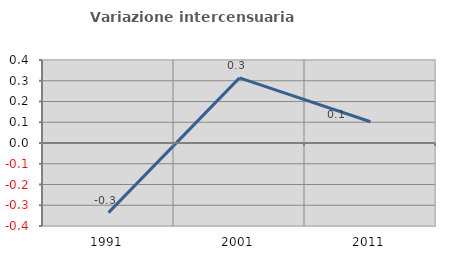
| Category | Variazione intercensuaria annua |
|---|---|
| 1991.0 | -0.336 |
| 2001.0 | 0.314 |
| 2011.0 | 0.102 |